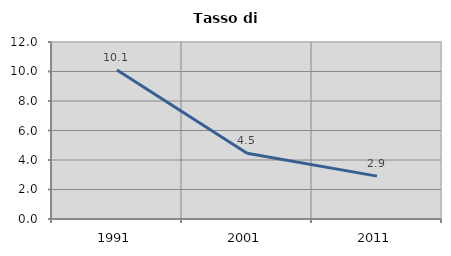
| Category | Tasso di disoccupazione   |
|---|---|
| 1991.0 | 10.098 |
| 2001.0 | 4.452 |
| 2011.0 | 2.907 |